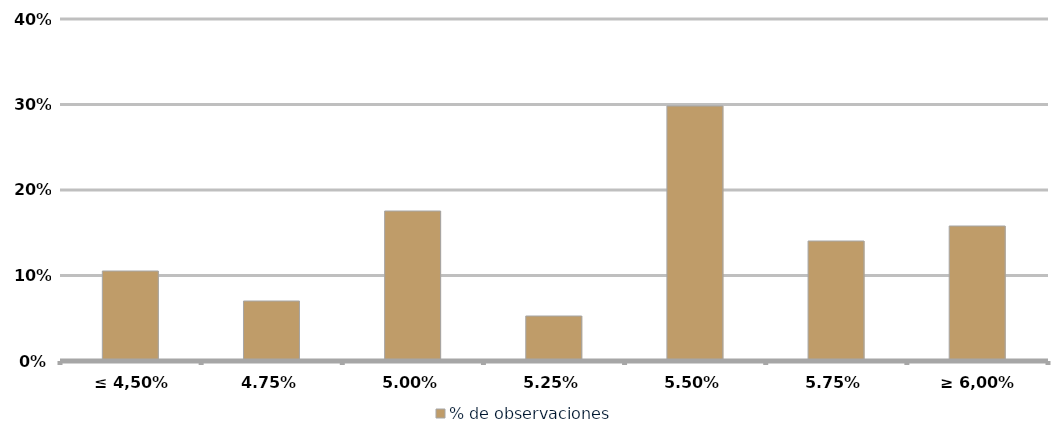
| Category | % de observaciones  |
|---|---|
| ≤ 4,50% | 0.105 |
| 4,75% | 0.07 |
| 5,00% | 0.175 |
| 5,25% | 0.053 |
| 5,50% | 0.298 |
| 5,75% | 0.14 |
| ≥ 6,00% | 0.158 |